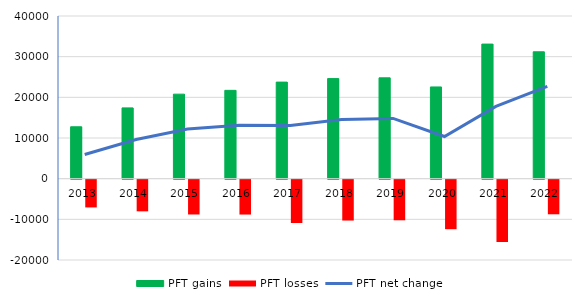
| Category | PFT gains | PFT losses |
|---|---|---|
| 2013 | 12759 | -6829 |
| 2014 | 17399 | -7787 |
| 2015 | 20781 | -8563 |
| 2016 | 21717 | -8578 |
| 2017 | 23742 | -10655 |
| 2018 | 24606 | -10051 |
| 2019 | 24793 | -9987 |
| 2020 | 22554 | -12182 |
| 2021 | 33093 | -15333 |
| 2022 | 31199 | -8515 |